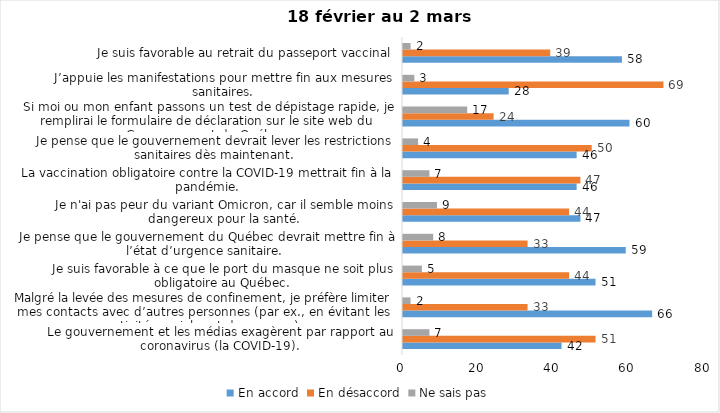
| Category | En accord | En désaccord | Ne sais pas |
|---|---|---|---|
| Le gouvernement et les médias exagèrent par rapport au coronavirus (la COVID-19). | 42 | 51 | 7 |
| Malgré la levée des mesures de confinement, je préfère limiter mes contacts avec d’autres personnes (par ex., en évitant les activités sociales et de groupes) | 66 | 33 | 2 |
| Je suis favorable à ce que le port du masque ne soit plus obligatoire au Québec. | 51 | 44 | 5 |
| Je pense que le gouvernement du Québec devrait mettre fin à l’état d’urgence sanitaire.  | 59 | 33 | 8 |
| Je n'ai pas peur du variant Omicron, car il semble moins dangereux pour la santé. | 47 | 44 | 9 |
| La vaccination obligatoire contre la COVID-19 mettrait fin à la pandémie. | 46 | 47 | 7 |
| Je pense que le gouvernement devrait lever les restrictions sanitaires dès maintenant. | 46 | 50 | 4 |
| Si moi ou mon enfant passons un test de dépistage rapide, je remplirai le formulaire de déclaration sur le site web du Gouvernement du Québec. | 60 | 24 | 17 |
| J’appuie les manifestations pour mettre fin aux mesures sanitaires. | 28 | 69 | 3 |
| Je suis favorable au retrait du passeport vaccinal | 58 | 39 | 2 |